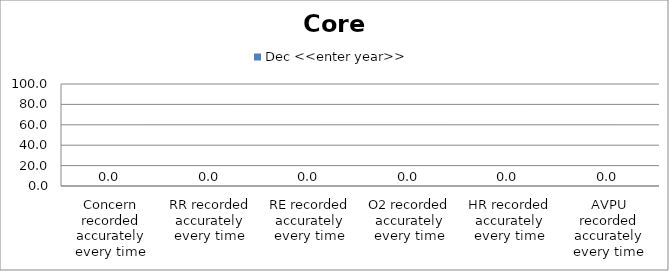
| Category | Dec <<enter year>> |
|---|---|
| Concern recorded accurately every time | 0 |
| RR recorded accurately every time | 0 |
| RE recorded accurately every time | 0 |
| O2 recorded accurately every time | 0 |
| HR recorded accurately every time | 0 |
| AVPU recorded accurately every time | 0 |